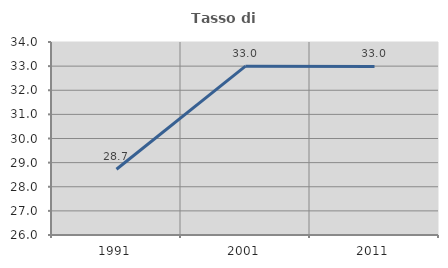
| Category | Tasso di occupazione   |
|---|---|
| 1991.0 | 28.727 |
| 2001.0 | 32.998 |
| 2011.0 | 32.989 |